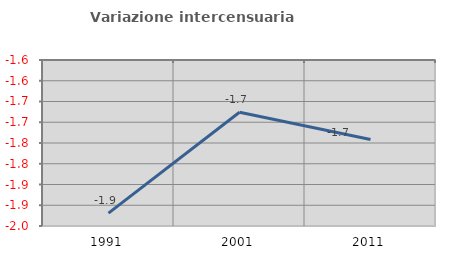
| Category | Variazione intercensuaria annua |
|---|---|
| 1991.0 | -1.919 |
| 2001.0 | -1.676 |
| 2011.0 | -1.742 |